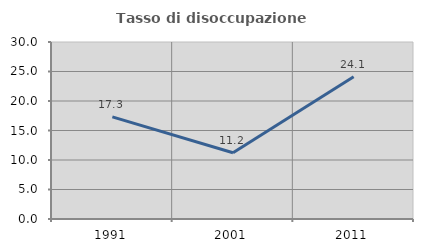
| Category | Tasso di disoccupazione giovanile  |
|---|---|
| 1991.0 | 17.315 |
| 2001.0 | 11.224 |
| 2011.0 | 24.092 |